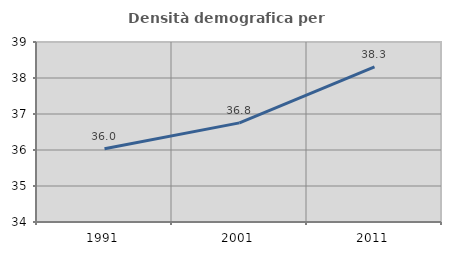
| Category | Densità demografica |
|---|---|
| 1991.0 | 36.037 |
| 2001.0 | 36.753 |
| 2011.0 | 38.306 |